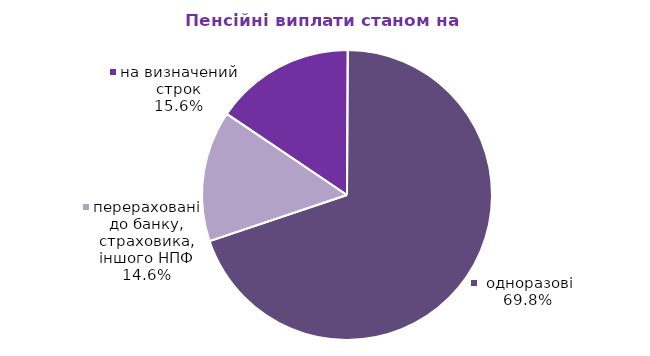
| Category | Series 0 |
|---|---|
| на визначений строк | 80.362 |
|  одноразові | 358.484 |
| перераховані до банку, страховика, іншого НПФ | 75.03 |